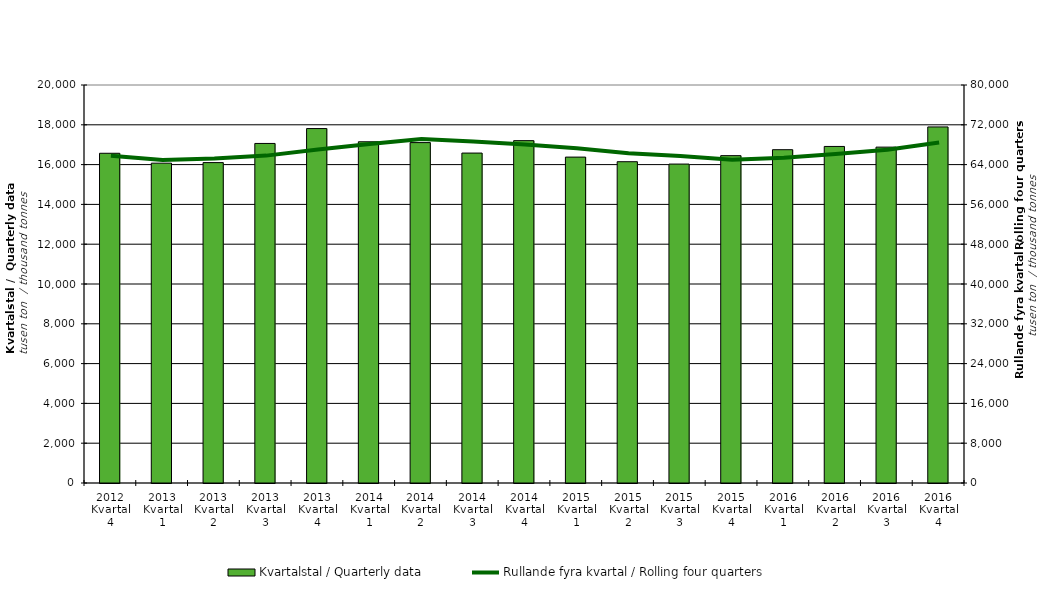
| Category | Kvartalstal / Quarterly data |
|---|---|
| 2012 Kvartal 4 | 16569.563 |
| 2013 Kvartal 1 | 16072.217 |
| 2013 Kvartal 2 | 16100.045 |
| 2013 Kvartal 3 | 17062.958 |
| 2013 Kvartal 4 | 17811.357 |
| 2014 Kvartal 1 | 17146.805 |
| 2014 Kvartal 2 | 17105.179 |
| 2014 Kvartal 3 | 16579.663 |
| 2014 Kvartal 4 | 17203.242 |
| 2015 Kvartal 1 | 16376.707 |
| 2015 Kvartal 2 | 16145.019 |
| 2015 Kvartal 3 | 16026.933 |
| 2015 Kvartal 4 | 16449.975 |
| 2016 Kvartal 1 | 16748.798 |
| 2016 Kvartal 2 | 16912.184 |
| 2016 Kvartal 3 | 16877.401 |
| 2016 Kvartal 4 | 17892.615 |